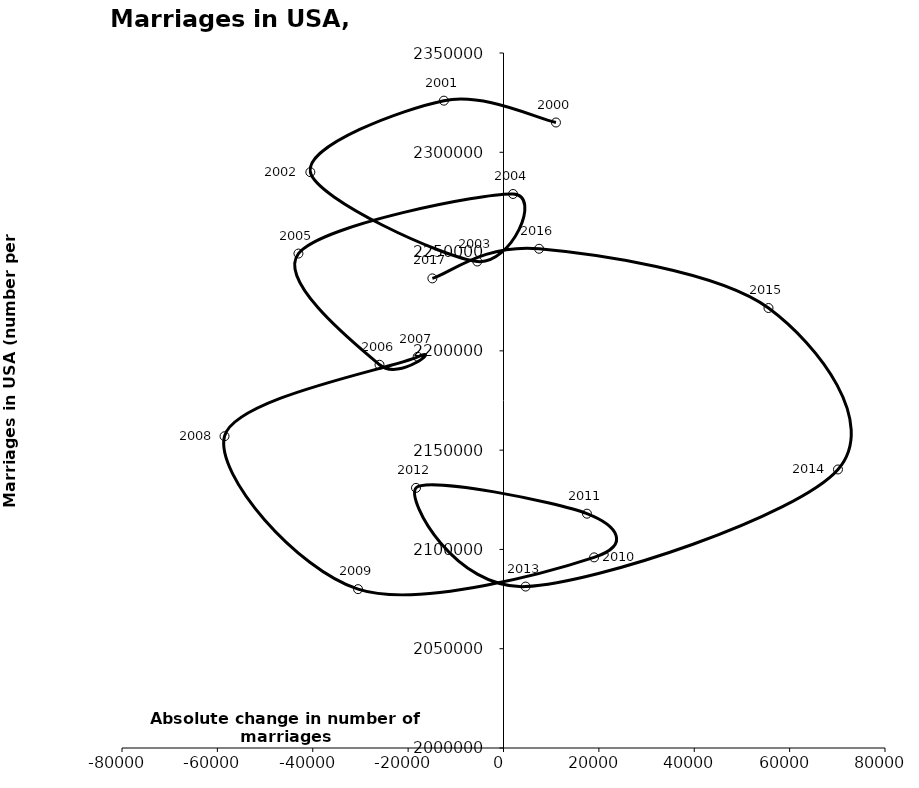
| Category | Series 0 |
|---|---|
| 11000.0 | 2315000 |
| -12500.0 | 2326000 |
| -40500.0 | 2290000 |
| -5500.0 | 2245000 |
| 2000.0 | 2279000 |
| -43000.0 | 2249000 |
| -26000.0 | 2193000 |
| -18000.0 | 2197000 |
| -58500.0 | 2157000 |
| -30500.0 | 2080000 |
| 19000.0 | 2096000 |
| 17500.0 | 2118000 |
| -18349.5 | 2131000 |
| 4636.0 | 2081301 |
| 70139.0 | 2140272 |
| 55569.5 | 2221579 |
| 7458.5 | 2251411 |
| -14915.0 | 2236496 |